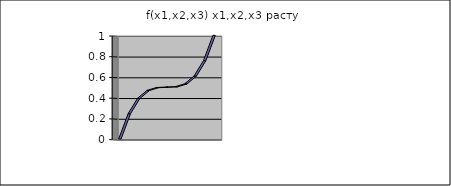
| Category | f(x1,x2,x3) x1,x2,x3 растут |
|---|---|
| 0 | 0 |
| 1 | 0.244 |
| 2 | 0.392 |
| 3 | 0.468 |
| 4 | 0.496 |
| 5 | 0.5 |
| 6 | 0.504 |
| 7 | 0.532 |
| 8 | 0.608 |
| 9 | 0.756 |
| 10 | 1 |